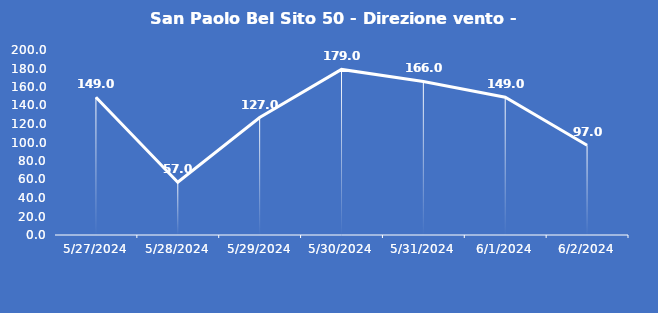
| Category | San Paolo Bel Sito 50 - Direzione vento - Grezzo (°N) |
|---|---|
| 5/27/24 | 149 |
| 5/28/24 | 57 |
| 5/29/24 | 127 |
| 5/30/24 | 179 |
| 5/31/24 | 166 |
| 6/1/24 | 149 |
| 6/2/24 | 97 |